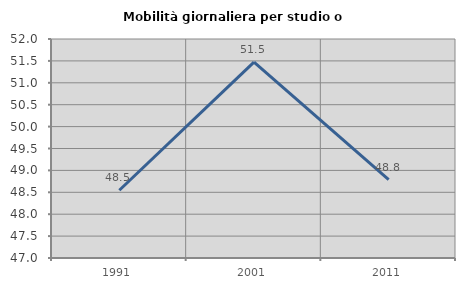
| Category | Mobilità giornaliera per studio o lavoro |
|---|---|
| 1991.0 | 48.547 |
| 2001.0 | 51.474 |
| 2011.0 | 48.789 |